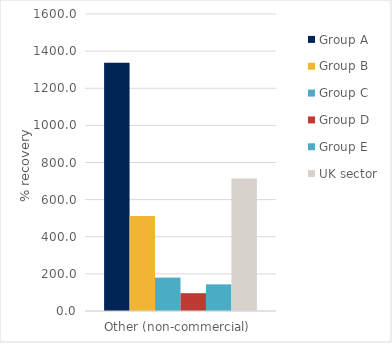
| Category | Group A | Group B | Group C | Group D | Group E | UK sector |
|---|---|---|---|---|---|---|
| Other (non-commercial)  | 1337.38 | 511.693 | 179.967 | 95.968 | 143.473 | 714.327 |